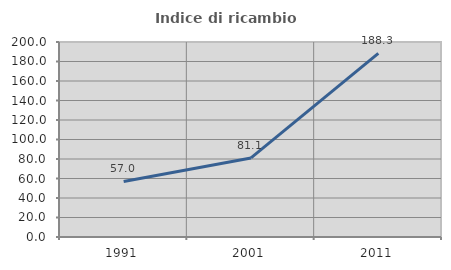
| Category | Indice di ricambio occupazionale  |
|---|---|
| 1991.0 | 56.983 |
| 2001.0 | 81.094 |
| 2011.0 | 188.296 |